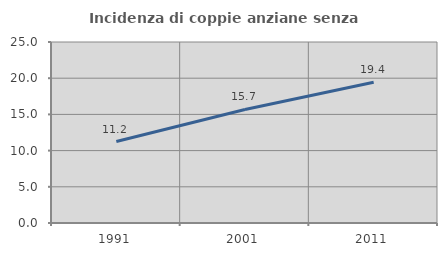
| Category | Incidenza di coppie anziane senza figli  |
|---|---|
| 1991.0 | 11.249 |
| 2001.0 | 15.677 |
| 2011.0 | 19.448 |